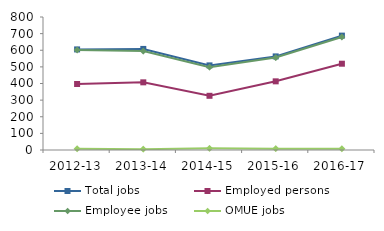
| Category | Total jobs | Employed persons | Employee jobs | OMUE jobs |
|---|---|---|---|---|
| 2012-13 | 605 | 397 | 601 | 8 |
| 2013-14 | 608 | 407 | 595 | 5 |
| 2014-15 | 509 | 326 | 498 | 10 |
| 2015-16 | 563 | 413 | 556 | 8 |
| 2016-17 | 688 | 519 | 680 | 8 |